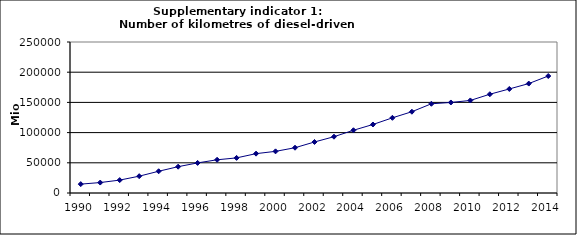
| Category | Number of kilometres of diesel-driven passenger cars, Mio km |
|---|---|
| 1990 | 14712.019 |
| 1991 | 17297.153 |
| 1992 | 21346.156 |
| 1993 | 27849.952 |
| 1994 | 36005.149 |
| 1995 | 43584.831 |
| 1996 | 49839.723 |
| 1997 | 54993.51 |
| 1998 | 58139.229 |
| 1999 | 65154.066 |
| 2000 | 68949.27 |
| 2001 | 74959.725 |
| 2002 | 84463.066 |
| 2003 | 93189.647 |
| 2004 | 103878.155 |
| 2005 | 113415.707 |
| 2006 | 124465.689 |
| 2007 | 134584.021 |
| 2008 | 147732.314 |
| 2009 | 149868.491 |
| 2010 | 153239.637 |
| 2011 | 163516.76 |
| 2012 | 172242.912 |
| 2013 | 181183.032 |
| 2014 | 193685.713 |